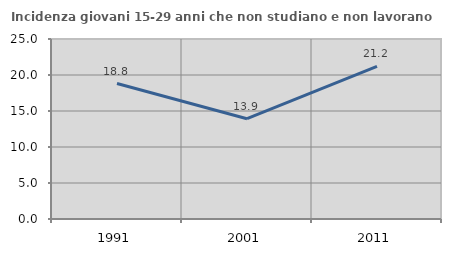
| Category | Incidenza giovani 15-29 anni che non studiano e non lavorano  |
|---|---|
| 1991.0 | 18.811 |
| 2001.0 | 13.93 |
| 2011.0 | 21.194 |